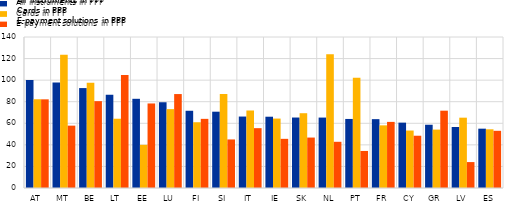
| Category | All instruments in PPP | Cards in PPP | E-payment solutions in PPP |
|---|---|---|---|
| AT | 100.19 | 82.4 | 82.2 |
| MT | 97.73 | 123.52 | 57.82 |
| BE | 92.64 | 97.49 | 80.52 |
| LT | 86.45 | 64.22 | 104.79 |
| EE | 82.7 | 40.02 | 78.38 |
| LU | 79.47 | 73.12 | 87.1 |
| FI | 71.61 | 60.96 | 64.11 |
| SI | 70.75 | 87.12 | 45.01 |
| IT | 66.25 | 71.86 | 55.47 |
| IE | 66.09 | 64.37 | 45.58 |
| SK | 65.34 | 69.34 | 46.77 |
| NL | 65.29 | 124.08 | 42.84 |
| PT | 64.02 | 102.12 | 34.35 |
| FR | 63.83 | 58.08 | 61.296 |
| CY | 60.59 | 53.28 | 48.47 |
| GR | 58.65 | 54.15 | 71.68 |
| LV | 56.55 | 65.2 | 24.03 |
| ES | 55.01 | 54.42 | 53.02 |